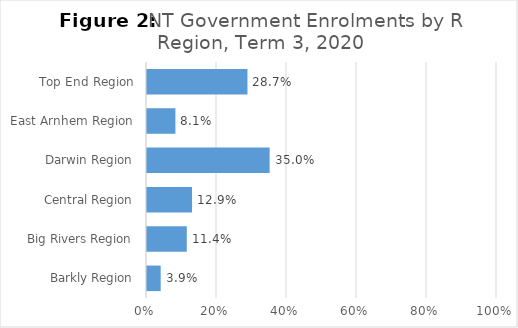
| Category | Enrolment |
|---|---|
| Barkly Region | 0.039 |
| Big Rivers Region | 0.114 |
| Central Region | 0.129 |
| Darwin Region | 0.35 |
| East Arnhem Region | 0.081 |
| Top End Region | 0.287 |